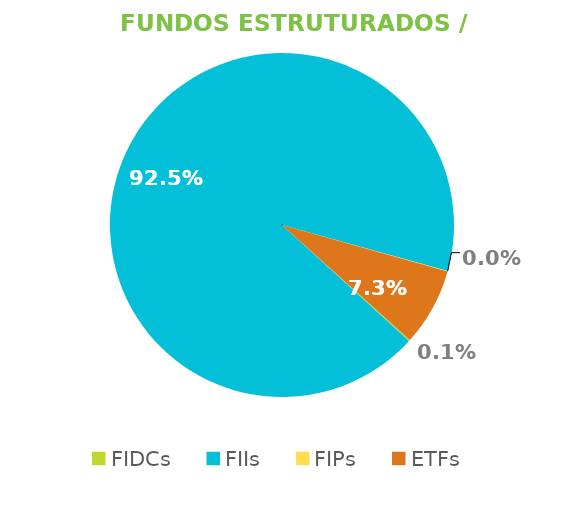
| Category | Fundos Estruturados / ETFs |
|---|---|
| FIDCs | 0.001 |
| FIIs | 0.925 |
| FIPs | 0 |
| ETFs | 0.073 |